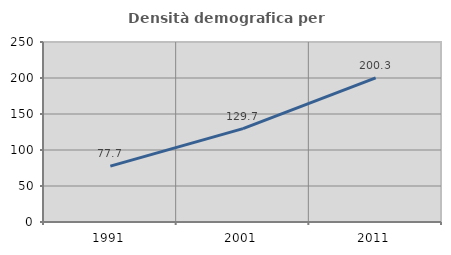
| Category | Densità demografica |
|---|---|
| 1991.0 | 77.656 |
| 2001.0 | 129.71 |
| 2011.0 | 200.251 |